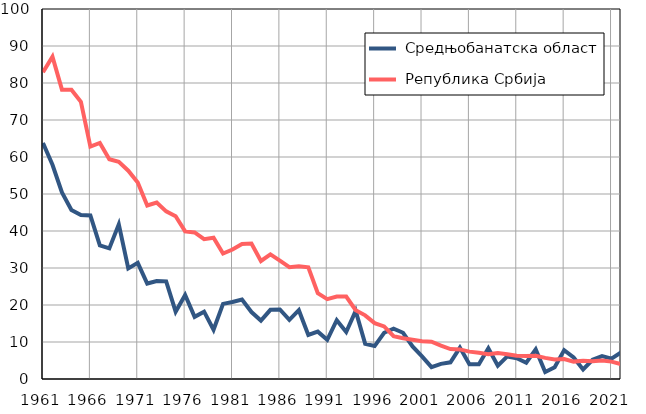
| Category |  Средњобанатска област |  Република Србија |
|---|---|---|
| 1961.0 | 63.8 | 82.9 |
| 1962.0 | 57.9 | 87.1 |
| 1963.0 | 50.4 | 78.2 |
| 1964.0 | 45.7 | 78.2 |
| 1965.0 | 44.3 | 74.9 |
| 1966.0 | 44.2 | 62.8 |
| 1967.0 | 36.1 | 63.8 |
| 1968.0 | 35.3 | 59.4 |
| 1969.0 | 41.8 | 58.7 |
| 1970.0 | 29.9 | 56.3 |
| 1971.0 | 31.4 | 53.1 |
| 1972.0 | 25.8 | 46.9 |
| 1973.0 | 26.5 | 47.7 |
| 1974.0 | 26.4 | 45.3 |
| 1975.0 | 18.2 | 44 |
| 1976.0 | 22.7 | 39.9 |
| 1977.0 | 16.8 | 39.6 |
| 1978.0 | 18.2 | 37.8 |
| 1979.0 | 13.3 | 38.2 |
| 1980.0 | 20.3 | 33.9 |
| 1981.0 | 20.8 | 35 |
| 1982.0 | 21.5 | 36.5 |
| 1983.0 | 18.1 | 36.6 |
| 1984.0 | 15.8 | 31.9 |
| 1985.0 | 18.7 | 33.7 |
| 1986.0 | 18.8 | 32 |
| 1987.0 | 16 | 30.2 |
| 1988.0 | 18.6 | 30.5 |
| 1989.0 | 11.9 | 30.2 |
| 1990.0 | 12.8 | 23.2 |
| 1991.0 | 10.6 | 21.6 |
| 1992.0 | 15.9 | 22.3 |
| 1993.0 | 12.7 | 22.3 |
| 1994.0 | 18.4 | 18.6 |
| 1995.0 | 9.5 | 17.2 |
| 1996.0 | 8.9 | 15.1 |
| 1997.0 | 12.5 | 14.2 |
| 1998.0 | 13.6 | 11.6 |
| 1999.0 | 12.5 | 11 |
| 2000.0 | 8.8 | 10.6 |
| 2001.0 | 6.1 | 10.2 |
| 2002.0 | 3.2 | 10.1 |
| 2003.0 | 4.1 | 9 |
| 2004.0 | 4.5 | 8.1 |
| 2005.0 | 8.5 | 8 |
| 2006.0 | 4 | 7.4 |
| 2007.0 | 4 | 7.1 |
| 2008.0 | 8.3 | 6.7 |
| 2009.0 | 3.6 | 7 |
| 2010.0 | 6.1 | 6.7 |
| 2011.0 | 5.6 | 6.3 |
| 2012.0 | 4.4 | 6.2 |
| 2013.0 | 8 | 6.3 |
| 2014.0 | 1.9 | 5.7 |
| 2015.0 | 3.2 | 5.3 |
| 2016.0 | 7.8 | 5.4 |
| 2017.0 | 5.8 | 4.7 |
| 2018.0 | 2.6 | 4.9 |
| 2019.0 | 5.2 | 4.8 |
| 2020.0 | 6.2 | 5 |
| 2021.0 | 5.5 | 4.7 |
| 2022.0 | 7.2 | 4 |